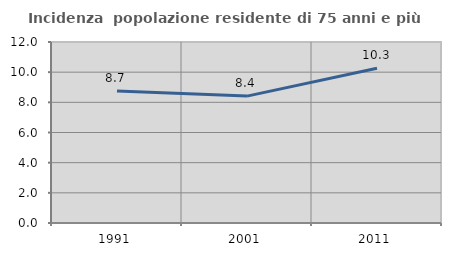
| Category | Incidenza  popolazione residente di 75 anni e più |
|---|---|
| 1991.0 | 8.749 |
| 2001.0 | 8.413 |
| 2011.0 | 10.258 |